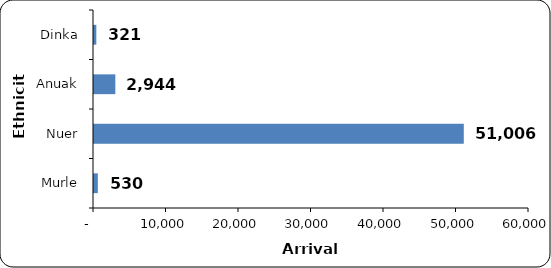
| Category | Number |
|---|---|
| Murle | 530 |
| Nuer | 51006 |
| Anuak | 2944 |
| Dinka | 321 |